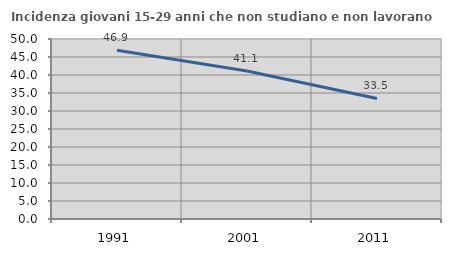
| Category | Incidenza giovani 15-29 anni che non studiano e non lavorano  |
|---|---|
| 1991.0 | 46.9 |
| 2001.0 | 41.105 |
| 2011.0 | 33.476 |